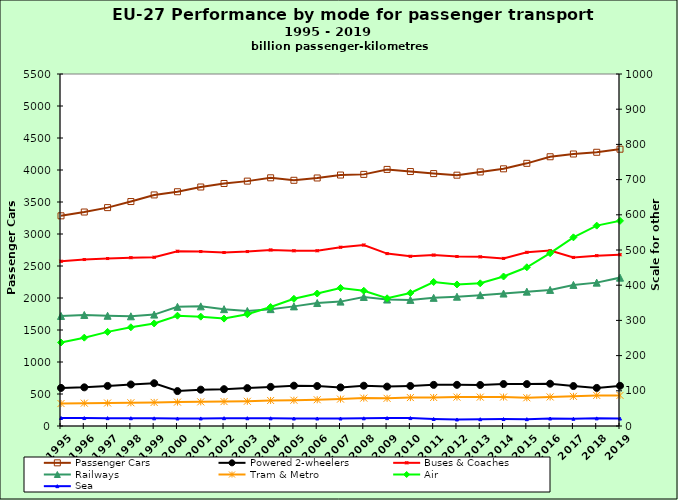
| Category | Passenger Cars |
|---|---|
| 1995.0 | 3283.764 |
| 1996.0 | 3343.401 |
| 1997.0 | 3412.199 |
| 1998.0 | 3507.134 |
| 1999.0 | 3610.558 |
| 2000.0 | 3660.355 |
| 2001.0 | 3734.216 |
| 2002.0 | 3789.305 |
| 2003.0 | 3826.196 |
| 2004.0 | 3878.163 |
| 2005.0 | 3839.179 |
| 2006.0 | 3875.261 |
| 2007.0 | 3921.256 |
| 2008.0 | 3931.624 |
| 2009.0 | 4009.212 |
| 2010.0 | 3975.851 |
| 2011.0 | 3943.643 |
| 2012.0 | 3918.966 |
| 2013.0 | 3969.282 |
| 2014.0 | 4018.52 |
| 2015.0 | 4104.019 |
| 2016.0 | 4206.805 |
| 2017.0 | 4250.014 |
| 2018.0 | 4276.913 |
| 2019.0 | 4324.998 |